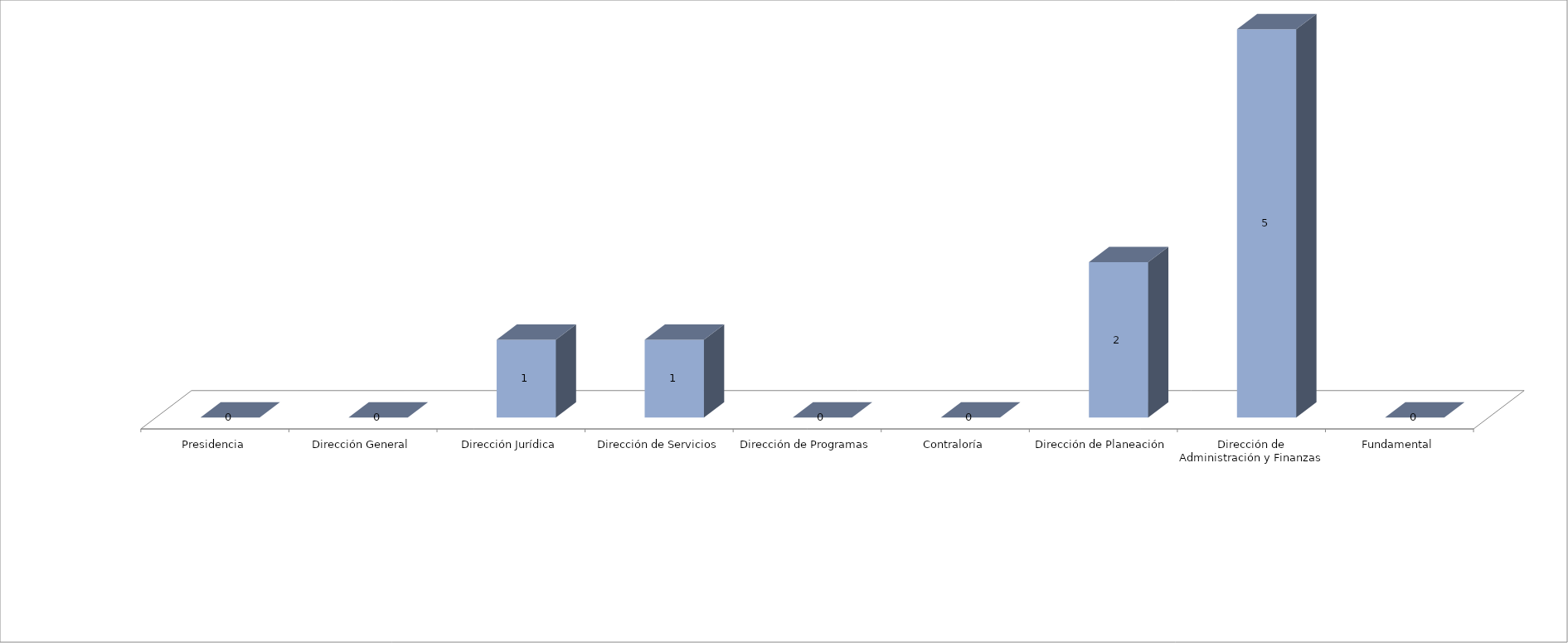
| Category | Series 0 | Series 1 |
|---|---|---|
| Presidencia |  | 0 |
| Dirección General |  | 0 |
| Dirección Jurídica |  | 1 |
| Dirección de Servicios |  | 1 |
| Dirección de Programas |  | 0 |
| Contraloría |  | 0 |
| Dirección de Planeación |  | 2 |
| Dirección de Administración y Finanzas |  | 5 |
| Fundamental |  | 0 |